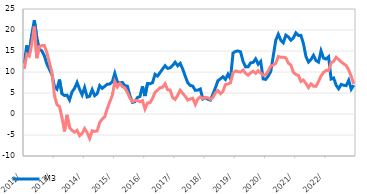
| Category | M3  | Домаћи кредити немонетарном сектору |
|---|---|---|
| 2012-01-01 | 12.01 | 10.729 |
| 2012-02-01 | 16.354 | 14.221 |
| 2012-03-01 | 13.992 | 13.782 |
| 2012-04-01 | 18.952 | 16.69 |
| 2012-05-01 | 22.329 | 20.823 |
| 2012-06-01 | 18.134 | 13.296 |
| 2012-07-01 | 15.507 | 16.043 |
| 2012-08-01 | 15.015 | 16.313 |
| 2012-09-01 | 13.837 | 16.292 |
| 2012-10-01 | 11.912 | 14.641 |
| 2012-11-01 | 10.629 | 12.241 |
| 2012-12-01 | 9.421 | 9.834 |
| 2013-01-01 | 6.554 | 4.448 |
| 2013-02-01 | 5.916 | 2.211 |
| 2013-03-01 | 8.196 | 1.791 |
| 2013-04-01 | 4.809 | -0.816 |
| 2013-05-01 | 4.39 | -4.149 |
| 2013-06-01 | 4.482 | -0.203 |
| 2013-07-01 | 3.358 | -3.232 |
| 2013-08-01 | 5.277 | -3.913 |
| 2013-09-01 | 6.108 | -4.338 |
| 2013-10-01 | 7.502 | -3.897 |
| 2013-11-01 | 5.896 | -5.181 |
| 2013-12-01 | 4.573 | -4.65 |
| 2014-01-01 | 6.313 | -3.453 |
| 2014-02-01 | 4.038 | -4.43 |
| 2014-03-01 | 4.234 | -5.804 |
| 2014-04-01 | 5.797 | -3.993 |
| 2014-05-01 | 4.358 | -4.149 |
| 2014-06-01 | 4.845 | -4.035 |
| 2014-07-01 | 6.767 | -2.016 |
| 2014-08-01 | 6.108 | -1.198 |
| 2014-09-01 | 6.605 | -0.64 |
| 2014-10-01 | 7.075 | 1.254 |
| 2014-11-01 | 7.143 | 2.875 |
| 2014-12-01 | 7.648 | 4.423 |
| 2015-01-01 | 9.694 | 7.684 |
| 2015-02-01 | 7.639 | 6.418 |
| 2015-03-01 | 7.404 | 7.278 |
| 2015-04-01 | 7.508 | 6.557 |
| 2015-05-01 | 6.749 | 6.196 |
| 2015-06-01 | 6.629 | 5.14 |
| 2015-07-01 | 4.381 | 3.777 |
| 2015-08-01 | 2.769 | 2.956 |
| 2015-09-01 | 2.936 | 3.226 |
| 2015-10-01 | 3.902 | 3.199 |
| 2015-11-01 | 4.175 | 2.893 |
| 2015-12-01 | 6.564 | 3.196 |
| 2016-01-01 | 4.278 | 1.199 |
| 2016-02-01 | 7.267 | 2.638 |
| 2016-03-01 | 7.218 | 2.687 |
| 2016-04-01 | 7.458 | 3.711 |
| 2016-05-01 | 9.45 | 5.171 |
| 2016-06-01 | 9.03 | 5.69 |
| 2016-07-01 | 9.881 | 6.257 |
| 2016-08-01 | 10.715 | 6.355 |
| 2016-09-01 | 11.496 | 7.196 |
| 2016-10-01 | 10.853 | 5.785 |
| 2016-11-01 | 11.002 | 5.691 |
| 2016-12-01 | 11.553 | 3.906 |
| 2017-01-01 | 12.319 | 3.475 |
| 2017-02-01 | 11.489 | 4.47 |
| 2017-03-01 | 12.067 | 5.654 |
| 2017-04-01 | 10.696 | 4.923 |
| 2017-05-01 | 9.013 | 4.221 |
| 2017-06-01 | 7.423 | 3.312 |
| 2017-07-01 | 6.807 | 3.565 |
| 2017-08-01 | 6.642 | 3.755 |
| 2017-09-01 | 5.632 | 2.278 |
| 2017-10-01 | 5.691 | 3.574 |
| 2017-11-01 | 5.952 | 4.092 |
| 2017-12-01 | 3.567 | 3.671 |
| 2018-01-01 | 3.888 | 3.977 |
| 2018-02-01 | 3.511 | 3.859 |
| 2018-03-01 | 3.318 | 3.502 |
| 2018-04-01 | 4.689 | 3.934 |
| 2018-05-01 | 6.249 | 5.016 |
| 2018-06-01 | 7.929 | 5.586 |
| 2018-07-01 | 8.383 | 4.847 |
| 2018-08-01 | 8.861 | 5.412 |
| 2018-09-01 | 8.24 | 7.016 |
| 2018-10-31 | 9.483 | 7.163 |
| 2018-11-30 | 8.409 | 7.417 |
| 2018-12-31 | 14.522 | 9.795 |
| 2019-01-31 | 14.909 | 10.252 |
| 2019-02-28 | 15.018 | 10.086 |
| 2019-03-31 | 14.797 | 9.982 |
| 2019-04-30 | 12.506 | 10.464 |
| 2019-05-31 | 11.216 | 9.694 |
| 2019-06-30 | 11.23 | 9.224 |
| 2019-07-31 | 12.186 | 9.826 |
| 2019-08-31 | 12.279 | 10.177 |
| 2019-09-30 | 13.127 | 9.697 |
| 2019-10-31 | 11.864 | 10.311 |
| 2019-11-30 | 12.513 | 9.755 |
| 2019-12-31 | 8.354 | 9.245 |
| 2020-01-31 | 8.237 | 9.334 |
| 2020-02-29 | 9.035 | 10.229 |
| 2020-03-31 | 10.113 | 11.424 |
| 2020-04-30 | 13.811 | 11.641 |
| 2020-05-31 | 17.557 | 12.071 |
| 2020-06-30 | 18.995 | 13.679 |
| 2020-07-31 | 17.552 | 13.526 |
| 2020-08-31 | 16.965 | 13.505 |
| 2020-09-30 | 18.779 | 13.379 |
| 2020-10-31 | 18.356 | 12.108 |
| 2020-11-30 | 17.578 | 11.663 |
| 2020-12-31 | 18.105 | 9.901 |
| 2021-01-31 | 19.323 | 9.428 |
| 2021-02-28 | 18.702 | 9.17 |
| 2021-03-31 | 18.724 | 7.735 |
| 2021-04-30 | 16.749 | 8.079 |
| 2021-05-31 | 13.689 | 7.279 |
| 2021-06-30 | 12.386 | 6.275 |
| 2021-07-31 | 12.98 | 7.175 |
| 2021-08-31 | 13.971 | 6.618 |
| 2021-09-30 | 12.717 | 6.585 |
| 2021-10-31 | 12.354 | 7.764 |
| 2021-11-30 | 15.024 | 9.049 |
| 2021-12-31 | 13.293 | 9.904 |
| 2022-01-31 | 13.088 | 10.364 |
| 2022-02-28 | 13.628 | 10.35 |
| 2022-03-31 | 8.323 | 12.2 |
| 2022-04-30 | 8.576 | 12.527 |
| 2022-05-31 | 6.855 | 13.492 |
| 2022-06-30 | 6.013 | 12.99 |
| 2022-07-31 | 7.048 | 12.403 |
| 2022-08-31 | 6.841 | 11.963 |
| 2022-09-30 | 6.755 | 11.535 |
| 2022-10-31 | 8.03 | 10.466 |
| 2022-11-30 | 5.915 | 8.996 |
| 2022-12-31 | 6.863 | 7.19 |